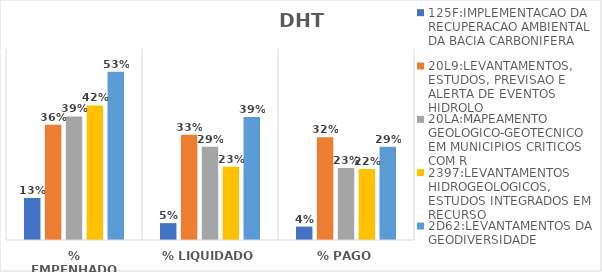
| Category | 125F:IMPLEMENTACAO DA RECUPERACAO AMBIENTAL DA BACIA CARBONIFERA | 20L9:LEVANTAMENTOS, ESTUDOS, PREVISAO E ALERTA DE EVENTOS HIDROLO | 20LA:MAPEAMENTO GEOLOGICO-GEOTECNICO EM MUNICIPIOS CRITICOS COM R | 2397:LEVANTAMENTOS HIDROGEOLOGICOS, ESTUDOS INTEGRADOS EM RECURSO | 2D62:LEVANTAMENTOS DA GEODIVERSIDADE |
|---|---|---|---|---|---|
| % EMPENHADO | 0.132 | 0.362 | 0.388 | 0.423 | 0.528 |
| % LIQUIDADO | 0.053 | 0.331 | 0.293 | 0.23 | 0.386 |
| % PAGO | 0.042 | 0.323 | 0.226 | 0.223 | 0.293 |